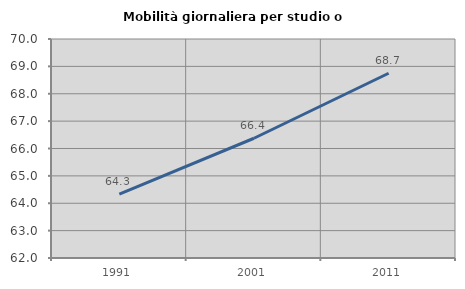
| Category | Mobilità giornaliera per studio o lavoro |
|---|---|
| 1991.0 | 64.337 |
| 2001.0 | 66.374 |
| 2011.0 | 68.749 |